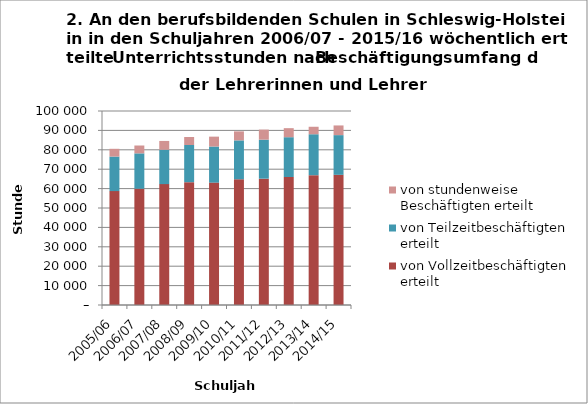
| Category | von Vollzeitbeschäftigten erteilt | von Teilzeitbeschäftigten erteilt | von stundenweise Beschäftigten erteilt |
|---|---|---|---|
| 2005/06 | 58716 | 17791 | 4005 |
| 2006/07 | 59945 | 18218 | 4049 |
| 2007/08 | 62310 | 17717 | 4535 |
| 2008/09 | 63318 | 19143 | 4127 |
| 2009/10 | 63082 | 18601 | 5100 |
| 2010/11 | 64821 | 20032 | 4645 |
| 2011/12 | 65119 | 20107 | 5192 |
| 2012/13 | 65972 | 20520 | 4659 |
| 2013/14 | 66913 | 21100 | 3862 |
| 2014/15 | 67101.5 | 20464.1 | 4987.2 |